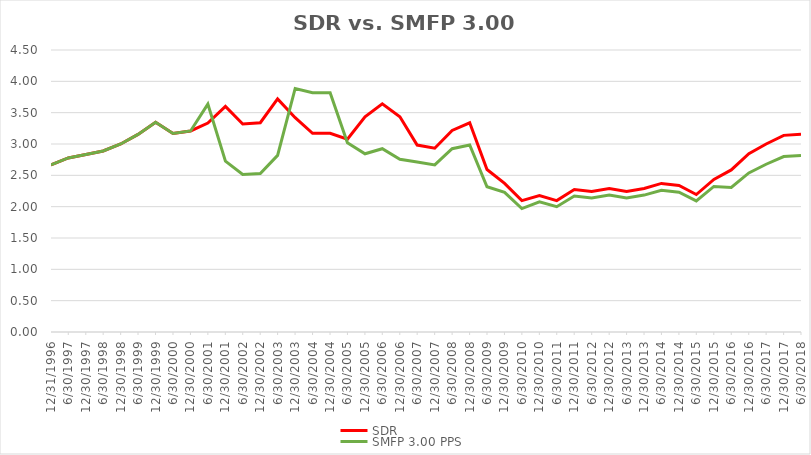
| Category | SDR | SMFP 3.00 PPS |
|---|---|---|
| 12/31/96 | 2.667 | 2.667 |
| 6/30/97 | 2.778 | 2.778 |
| 12/31/97 | 2.833 | 2.833 |
| 6/30/98 | 2.889 | 2.889 |
| 12/31/98 | 3 | 3 |
| 6/30/99 | 3.153 | 3.153 |
| 12/31/99 | 3.347 | 3.347 |
| 6/30/00 | 3.167 | 3.167 |
| 12/31/00 | 3.208 | 3.208 |
| 6/30/01 | 3.333 | 3.636 |
| 12/31/01 | 3.6 | 2.727 |
| 6/30/02 | 3.32 | 2.515 |
| 12/31/02 | 3.34 | 2.53 |
| 6/30/03 | 3.72 | 2.818 |
| 12/31/03 | 3.42 | 3.886 |
| 6/30/04 | 3.17 | 3.818 |
| 12/31/04 | 3.17 | 3.818 |
| 6/30/05 | 3.075 | 3.019 |
| 12/31/05 | 3.434 | 2.844 |
| 6/30/06 | 3.642 | 2.924 |
| 12/31/06 | 3.434 | 2.758 |
| 6/30/07 | 2.983 | 2.712 |
| 12/31/07 | 2.933 | 2.667 |
| 6/30/08 | 3.217 | 2.924 |
| 12/31/08 | 3.339 | 2.985 |
| 6/30/09 | 2.593 | 2.318 |
| 12/31/09 | 2.371 | 2.227 |
| 6/30/10 | 2.097 | 1.97 |
| 12/31/10 | 2.177 | 2.077 |
| 6/30/11 | 2.097 | 2 |
| 12/31/11 | 2.274 | 2.169 |
| 6/30/12 | 2.242 | 2.138 |
| 12/31/12 | 2.29 | 2.185 |
| 6/30/13 | 2.242 | 2.138 |
| 12/31/13 | 2.29 | 2.185 |
| 6/30/14 | 2.371 | 2.262 |
| 12/31/14 | 2.339 | 2.231 |
| 6/30/15 | 2.194 | 2.092 |
| 12/31/15 | 2.435 | 2.323 |
| 6/30/16 | 2.586 | 2.308 |
| 12/31/16 | 2.845 | 2.538 |
| 6/30/17 | 3 | 2.677 |
| 12/31/17 | 3.138 | 2.8 |
| 6/30/18 | 3.155 | 2.815 |